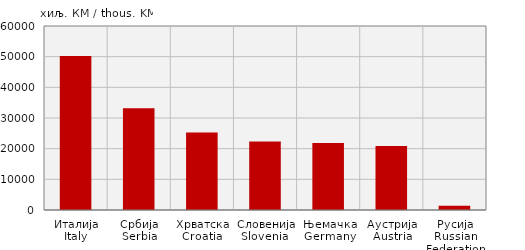
| Category | Извоз
Export |
|---|---|
| Италија
Italy | 50235 |
| Србија
Serbia | 33170 |
| Хрватска
Croatia | 25257 |
| Словенија
Slovenia  | 22308 |
| Њемачка
Germany | 21812 |
| Аустрија
Austria | 20898 |
| Русија
Russian Federation | 1381 |